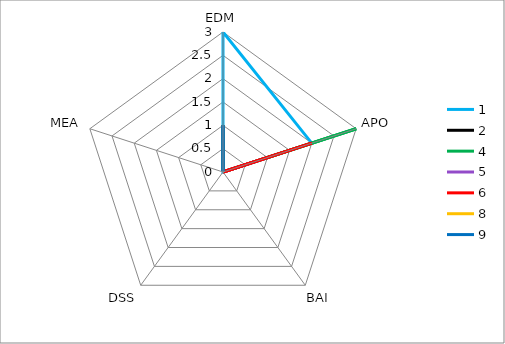
| Category | 1 | 2 | 4 | 5 | 6 | 8 | 9 |
|---|---|---|---|---|---|---|---|
| 0 | 3 | 1 | 0 | 0 | 0 | 1 | 1 |
| 1 | 2 | 0 | 3 | 1 | 2 | 0 | 0 |
| 2 | 0 | 0 | 0 | 0 | 0 | 0 | 0 |
| 3 | 0 | 0 | 0 | 0 | 0 | 0 | 0 |
| 4 | 0 | 0 | 0 | 0 | 0 | 0 | 0 |